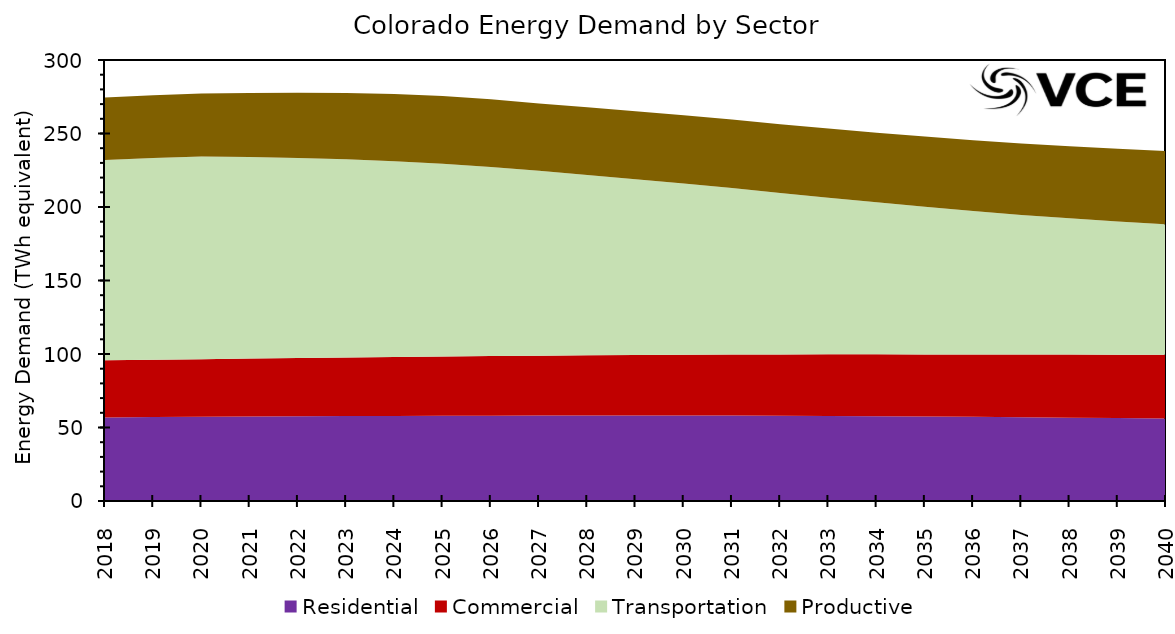
| Category | Residential | Commercial | Transportation | Productive |
|---|---|---|---|---|
| 2018.0 | 56885961.562 | 38895023.24 | 136204157.298 | 42435698.74 |
| 2019.0 | 57086092.615 | 39031910.975 | 137146502.229 | 42731514.532 |
| 2020.0 | 57267672.907 | 39213124.406 | 137834903.455 | 42970756.227 |
| 2021.0 | 57441166.413 | 39417117.273 | 137085325.594 | 43657337.934 |
| 2022.0 | 57606539.943 | 39656777.553 | 136069493.646 | 44341822.712 |
| 2023.0 | 57743691.078 | 39888298.422 | 134796117.464 | 45153261.57 |
| 2024.0 | 57855788.699 | 40118316.909 | 133161785.898 | 45738423.081 |
| 2025.0 | 57966350.269 | 40332686.321 | 131185254.981 | 45944833.31 |
| 2026.0 | 58067724.882 | 40539628.35 | 128661024.153 | 46010417.074 |
| 2027.0 | 58160035.546 | 40733539.575 | 125706404.765 | 45822086.419 |
| 2028.0 | 58232894.031 | 40926546.448 | 122644579.198 | 45981479.658 |
| 2029.0 | 58245774.515 | 41121362.623 | 119546623.66 | 46179897.393 |
| 2030.0 | 58226156.682 | 41315530.728 | 116414792.684 | 46402533.457 |
| 2031.0 | 58159014.79 | 41506257.07 | 113224894.346 | 46565413.879 |
| 2032.0 | 58040658.496 | 41699535.17 | 109865429.903 | 46716529.582 |
| 2033.0 | 57877741.641 | 41893822.431 | 106555244.237 | 46999140.737 |
| 2034.0 | 57688109.618 | 42089932.873 | 103377946.783 | 47408672.289 |
| 2035.0 | 57462613.494 | 42281999.698 | 100358635.875 | 47812339.345 |
| 2036.0 | 57232883.566 | 42469030.822 | 97538692.688 | 48164805.238 |
| 2037.0 | 56977507.654 | 42662600.108 | 94985803.482 | 48550881.579 |
| 2038.0 | 56716135.563 | 42865599.476 | 92709676.864 | 48992837.822 |
| 2039.0 | 56433924.101 | 43076438.927 | 90642226.922 | 49405685.616 |
| 2040.0 | 56136802.513 | 43301657.734 | 88702199.504 | 49837311.474 |